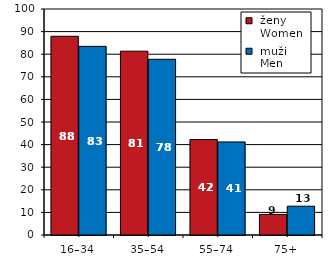
| Category |  ženy 
 Women |  muži 
 Men |
|---|---|---|
| 16–34 | 87.932 | 83.465 |
| 35–54 | 81.334 | 77.75 |
| 55–74 | 42.242 | 41.183 |
| 75+ | 9.094 | 12.747 |